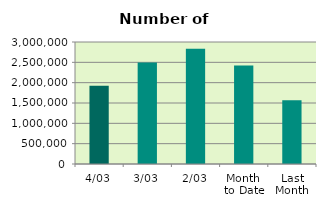
| Category | Series 0 |
|---|---|
| 4/03 | 1926148 |
| 3/03 | 2497014 |
| 2/03 | 2835404 |
| Month 
to Date | 2419522 |
| Last
Month | 1567888.4 |